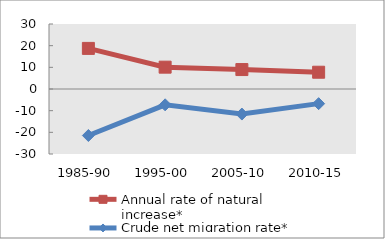
| Category | Annual rate of natural increase* | Crude net migration rate* |
|---|---|---|
| 1985-90 | 18.739 | -21.462 |
| 1995-00 | 10.076 | -7.305 |
| 2005-10 | 8.975 | -11.564 |
| 2010-15 | 7.742 | -6.759 |